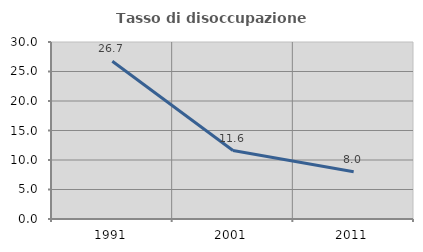
| Category | Tasso di disoccupazione giovanile  |
|---|---|
| 1991.0 | 26.738 |
| 2001.0 | 11.607 |
| 2011.0 | 8 |